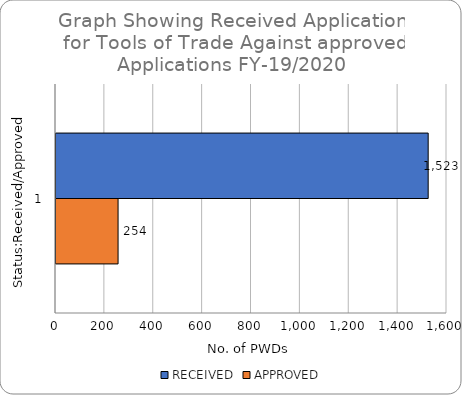
| Category | RECEIVED  | APPROVED |
|---|---|---|
| 0 | 1523 | 254 |